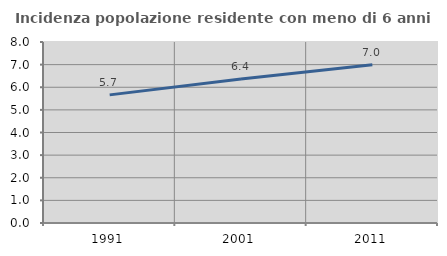
| Category | Incidenza popolazione residente con meno di 6 anni |
|---|---|
| 1991.0 | 5.663 |
| 2001.0 | 6.368 |
| 2011.0 | 6.996 |